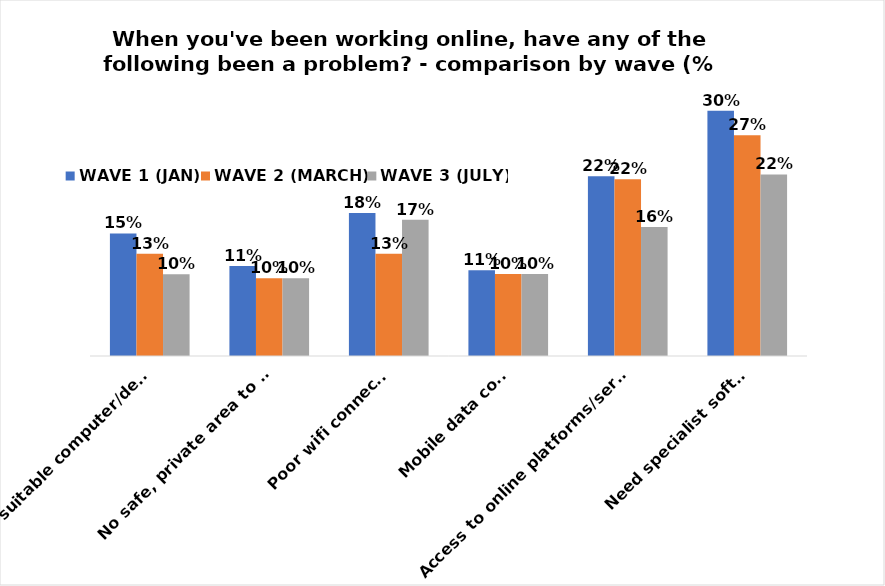
| Category | WAVE 1 (JAN) | WAVE 2 (MARCH) | WAVE 3 (JULY) |
|---|---|---|---|
| No suitable computer/device | 0.15 | 0.125 | 0.1 |
| No safe, private area to work | 0.11 | 0.095 | 0.095 |
| Poor wifi connection | 0.175 | 0.125 | 0.167 |
| Mobile data costs | 0.105 | 0.101 | 0.101 |
| Access to online platforms/services | 0.22 | 0.216 | 0.158 |
| Need specialist software | 0.3 | 0.27 | 0.222 |